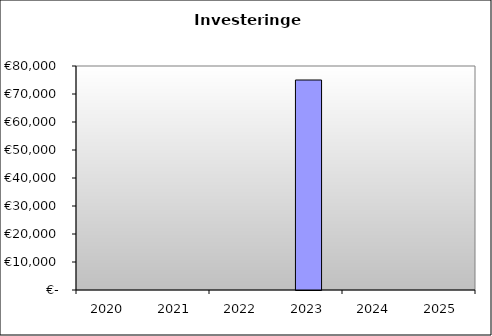
| Category | Investeringen |
|---|---|
| 2020.0 | 0 |
| 2021.0 | 0 |
| 2022.0 | 0 |
| 2023.0 | 75000 |
| 2024.0 | 0 |
| 2025.0 | 0 |